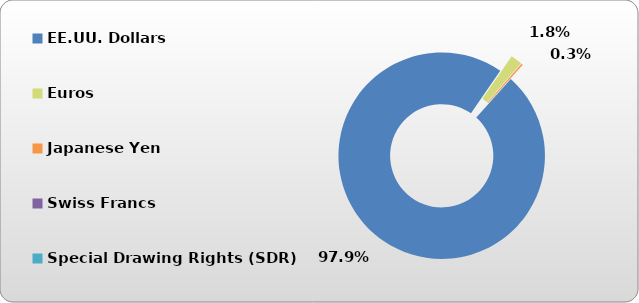
| Category | EE.UU. Dollars |
|---|---|
| EE.UU. Dollars | 45852.846 |
| Euros | 851.804 |
| Japanese Yen | 117.196 |
| Swiss Francs | 0 |
| Special Drawing Rights (SDR) | 2.72 |